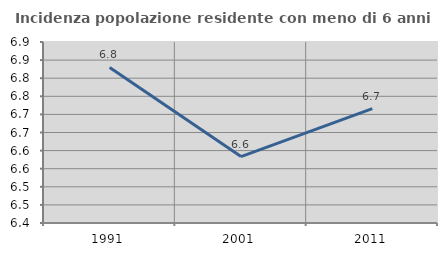
| Category | Incidenza popolazione residente con meno di 6 anni |
|---|---|
| 1991.0 | 6.83 |
| 2001.0 | 6.584 |
| 2011.0 | 6.716 |